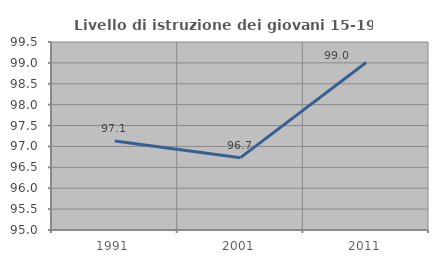
| Category | Livello di istruzione dei giovani 15-19 anni |
|---|---|
| 1991.0 | 97.131 |
| 2001.0 | 96.732 |
| 2011.0 | 99.01 |